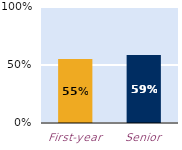
| Category | At least some |
|---|---|
| First-year | 0.551 |
| Senior | 0.587 |